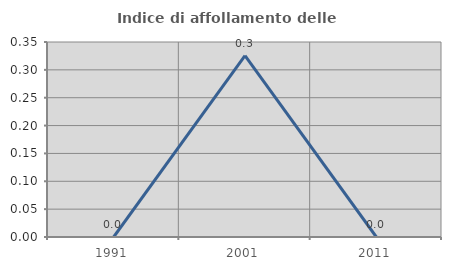
| Category | Indice di affollamento delle abitazioni  |
|---|---|
| 1991.0 | 0 |
| 2001.0 | 0.326 |
| 2011.0 | 0 |